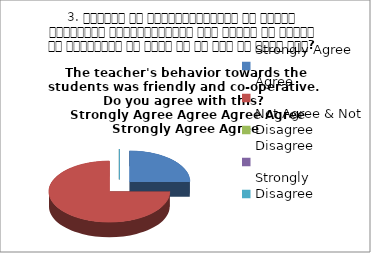
| Category | 3. शिक्षक का विद्यार्थियों के प्रति व्यव्हार मित्रतापूर्ण एवं सहयोग के भावना से परिपूर्ण था क्या आप इस बात से सहमत हैं? 
The teacher's behavior towards the students was friendly and co-operative.  Do you agree with this? 
 Strongly Agree Agree Agree Agree |
|---|---|
| Strongly Agree | 1 |
| Agree | 3 |
| Not Agree & Not Disagree | 0 |
| Disagree | 0 |
| Strongly Disagree | 0 |